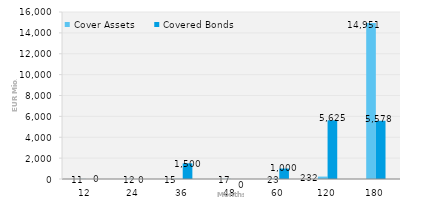
| Category | Cover Assets | Covered Bonds |
|---|---|---|
| 12.0 | 10.811 | 0 |
| 24.0 | 11.945 | 0 |
| 36.0 | 14.745 | 1500 |
| 48.0 | 16.623 | 0 |
| 60.0 | 22.509 | 1000 |
| 120.0 | 232.322 | 5625 |
| 180.0 | 14951.046 | 5578 |